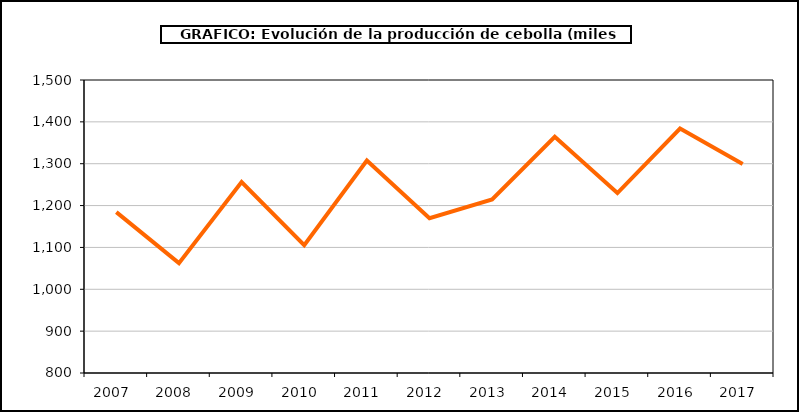
| Category | producción |
|---|---|
| 2007.0 | 1184.25 |
| 2008.0 | 1062.537 |
| 2009.0 | 1256.288 |
| 2010.0 | 1105.131 |
| 2011.0 | 1307.531 |
| 2012.0 | 1169.721 |
| 2013.0 | 1214.501 |
| 2014.0 | 1364.117 |
| 2015.0 | 1229.842 |
| 2016.0 | 1384.098 |
| 2017.0 | 1299.534 |